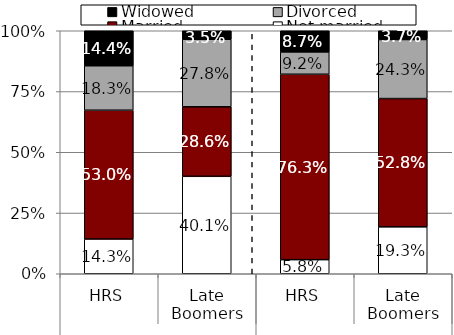
| Category | Not married | Married | Divorced | Widowed |
|---|---|---|---|---|
| 0 | 0.143 | 0.53 | 0.183 | 0.144 |
| 1 | 0.401 | 0.286 | 0.278 | 0.035 |
| 2 | 0.058 | 0.763 | 0.092 | 0.087 |
| 3 | 0.193 | 0.528 | 0.243 | 0.037 |